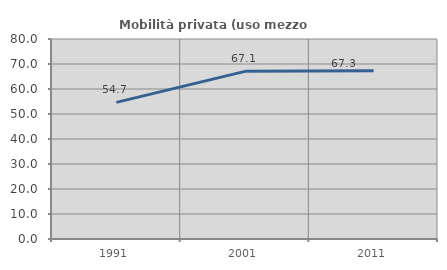
| Category | Mobilità privata (uso mezzo privato) |
|---|---|
| 1991.0 | 54.654 |
| 2001.0 | 67.056 |
| 2011.0 | 67.267 |